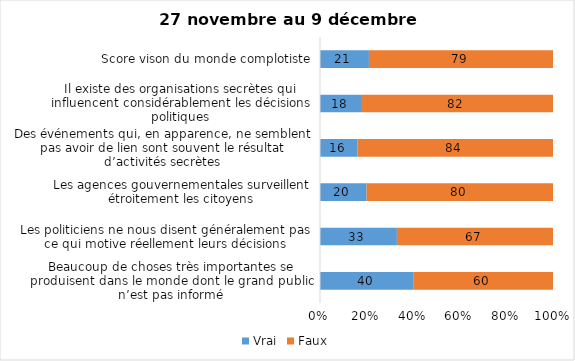
| Category | Vrai | Faux |
|---|---|---|
| Beaucoup de choses très importantes se produisent dans le monde dont le grand public n’est pas informé | 40 | 60 |
| Les politiciens ne nous disent généralement pas ce qui motive réellement leurs décisions | 33 | 67 |
| Les agences gouvernementales surveillent étroitement les citoyens | 20 | 80 |
| Des événements qui, en apparence, ne semblent pas avoir de lien sont souvent le résultat d’activités secrètes | 16 | 84 |
| Il existe des organisations secrètes qui influencent considérablement les décisions politiques | 18 | 82 |
| Score vison du monde complotiste | 21 | 79 |